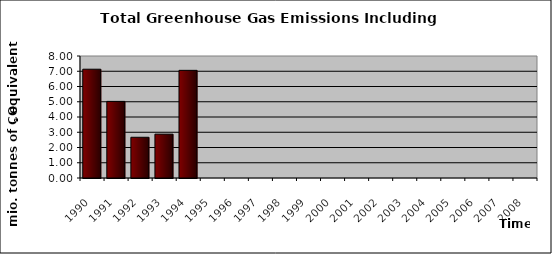
| Category | Series 0 |
|---|---|
| 1990.0 | 7.134 |
| 1991.0 | 5.023 |
| 1992.0 | 2.67 |
| 1993.0 | 2.875 |
| 1994.0 | 7.059 |
| 1995.0 | 0 |
| 1996.0 | 0 |
| 1997.0 | 0 |
| 1998.0 | 0 |
| 1999.0 | 0 |
| 2000.0 | 0 |
| 2001.0 | 0 |
| 2002.0 | 0 |
| 2003.0 | 0 |
| 2004.0 | 0 |
| 2005.0 | 0 |
| 2006.0 | 0 |
| 2007.0 | 0 |
| 2008.0 | 0 |